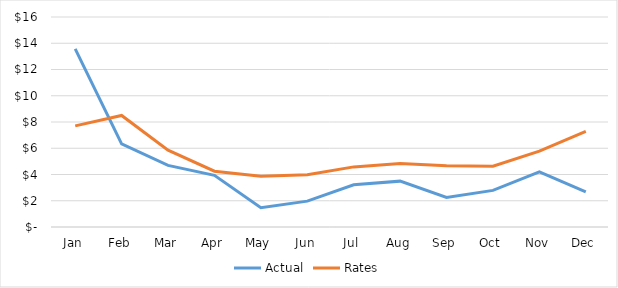
| Category | Actual | Rates |
|---|---|---|
| Jan | 13.576 | 7.707 |
| Feb | 6.336 | 8.5 |
| Mar | 4.69 | 5.85 |
| Apr | 3.938 | 4.25 |
| May | 1.468 | 3.87 |
| Jun | 1.97 | 3.98 |
| Jul | 3.218 | 4.58 |
| Aug | 3.494 | 4.83 |
| Sep | 2.251 | 4.67 |
| Oct | 2.792 | 4.63 |
| Nov | 4.202 | 5.78 |
| Dec | 2.669 | 7.28 |